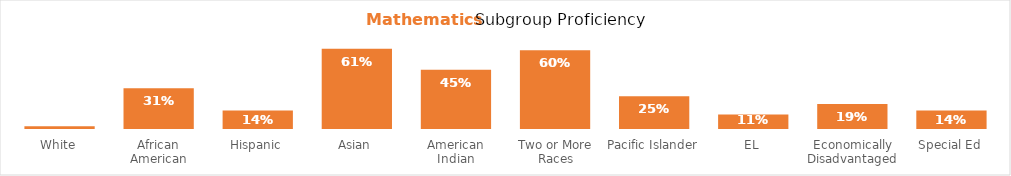
| Category | Mathematics |
|---|---|
| White | 0.02 |
| African American | 0.31 |
| Hispanic | 0.14 |
| Asian | 0.61 |
| American Indian | 0.45 |
| Two or More Races | 0.6 |
| Pacific Islander | 0.25 |
| EL | 0.11 |
| Economically Disadvantaged | 0.19 |
| Special Ed | 0.14 |